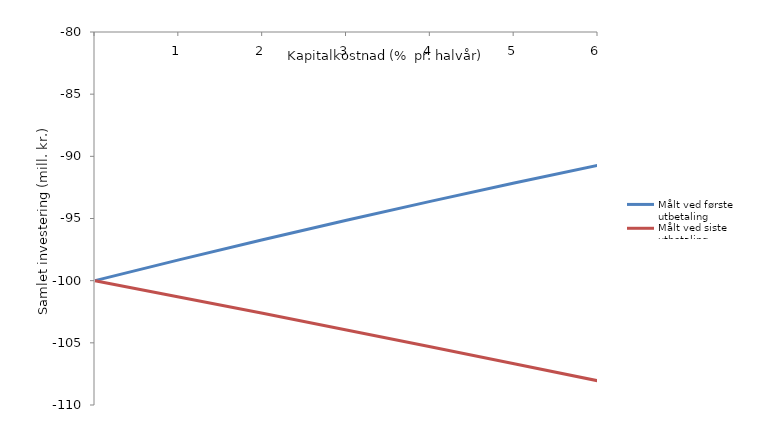
| Category | Målt ved første utbetaling | Målt ved siste utbetaling |
|---|---|---|
| nan | -100 | -100 |
| 1.0 | -98.328 | -101.307 |
| 2.0 | -96.709 | -102.628 |
| 3.0 | -95.141 | -103.963 |
| 4.0 | -93.623 | -105.313 |
| 5.0 | -92.151 | -106.676 |
| 6.000000000000001 | -90.724 | -108.054 |